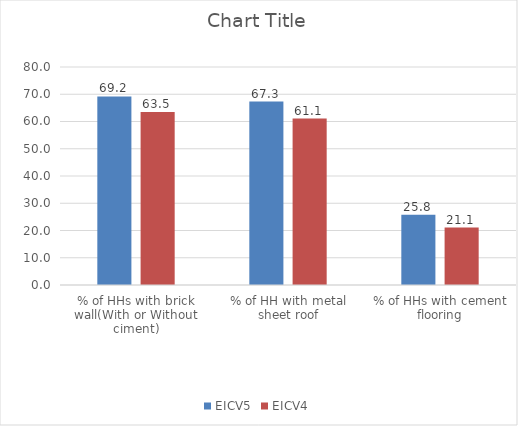
| Category | EICV5 | EICV4 |
|---|---|---|
| % of HHs with brick wall(With or Without ciment) | 69.2 | 63.5 |
| % of HH with metal sheet roof | 67.3 | 61.1 |
| % of HHs with cement flooring | 25.8 | 21.1 |